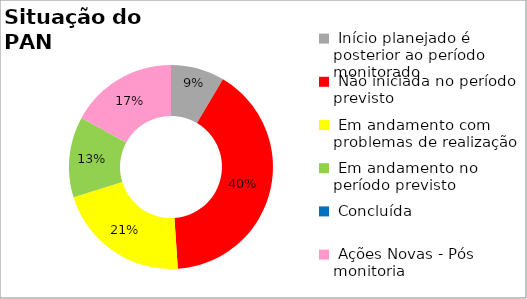
| Category | Series 0 |
|---|---|
|  Início planejado é posterior ao período monitorado | 0.085 |
|  Não iniciada no período previsto | 0.404 |
|  Em andamento com problemas de realização | 0.213 |
|  Em andamento no período previsto  | 0.128 |
|  Concluída | 0 |
|  Ações Novas - Pós monitoria | 0.17 |